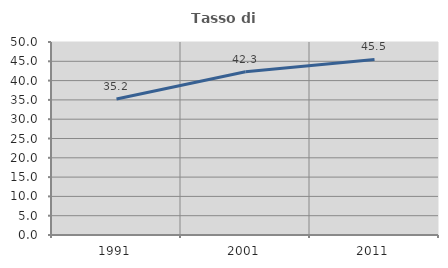
| Category | Tasso di occupazione   |
|---|---|
| 1991.0 | 35.216 |
| 2001.0 | 42.294 |
| 2011.0 | 45.49 |